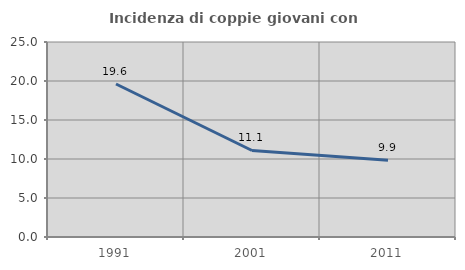
| Category | Incidenza di coppie giovani con figli |
|---|---|
| 1991.0 | 19.612 |
| 2001.0 | 11.09 |
| 2011.0 | 9.852 |